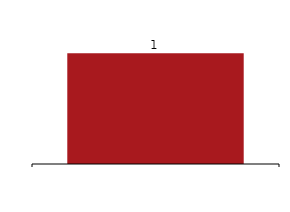
| Category | Series 0 |
|---|---|
|  | 1 |